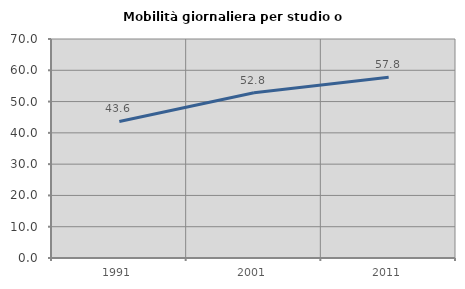
| Category | Mobilità giornaliera per studio o lavoro |
|---|---|
| 1991.0 | 43.634 |
| 2001.0 | 52.843 |
| 2011.0 | 57.783 |